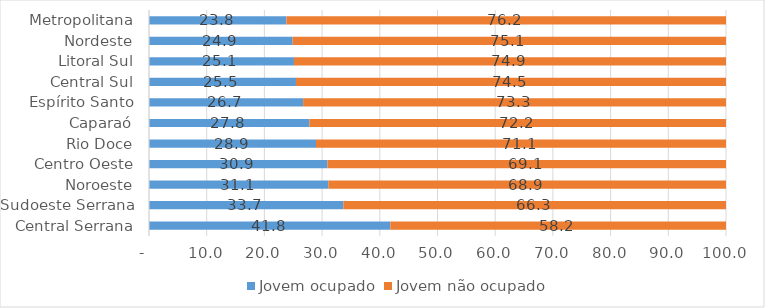
| Category | Jovem ocupado | Jovem não ocupado |
|---|---|---|
| Central Serrana | 41.823 | 58.177 |
| Sudoeste Serrana | 33.685 | 66.315 |
| Noroeste | 31.079 | 68.921 |
| Centro Oeste | 30.935 | 69.065 |
| Rio Doce | 28.947 | 71.053 |
| Caparaó | 27.809 | 72.191 |
| Espírito Santo | 26.713 | 73.287 |
| Central Sul | 25.472 | 74.528 |
| Litoral Sul | 25.126 | 74.874 |
| Nordeste | 24.897 | 75.103 |
| Metropolitana | 23.819 | 76.181 |